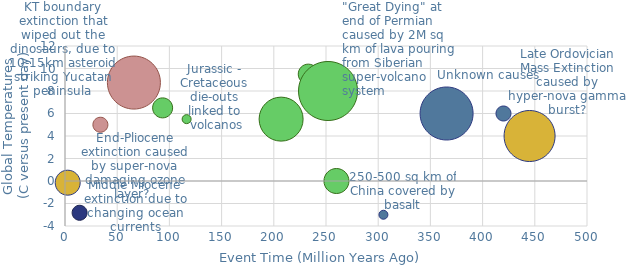
| Category | Series 0 |
|---|---|
| 2.58 | -0.15 |
| 14.0 | -2.825 |
| 33.9 | 5 |
| 66.0 | 8.75 |
| 93.5 | 6.5 |
| 116.5 | 5.5 |
| 207.0 | 5.5 |
| 233.0 | 9.5 |
| 251.95 | 8 |
| 260.0 | 0 |
| 305.0 | -3 |
| 365.5 | 6 |
| 420.0 | 6 |
| 445.0 | 4 |